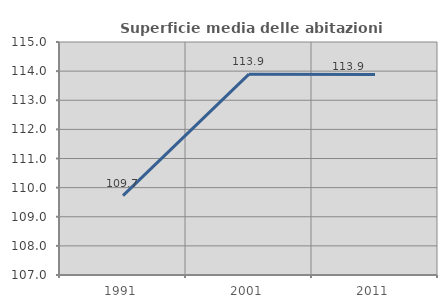
| Category | Superficie media delle abitazioni occupate |
|---|---|
| 1991.0 | 109.726 |
| 2001.0 | 113.895 |
| 2011.0 | 113.884 |